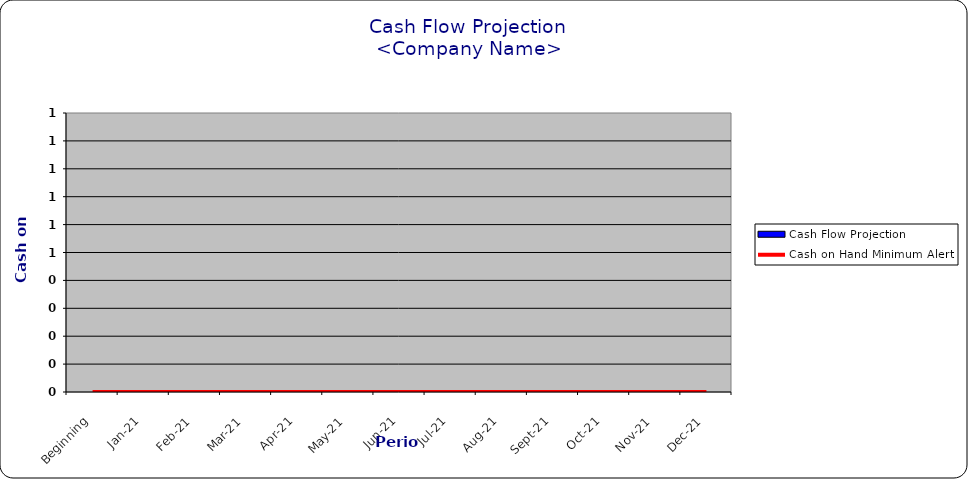
| Category | Cash Flow Projection |
|---|---|
| Beginning | 0 |
| Jan-21 | 0 |
| Feb-21 | 0 |
| Mar-21 | 0 |
| Apr-21 | 0 |
| May-21 | 0 |
| Jun-21 | 0 |
| Jul-21 | 0 |
| Aug-21 | 0 |
| Sep-21 | 0 |
| Oct-21 | 0 |
| Nov-21 | 0 |
| Dec-21 | 0 |